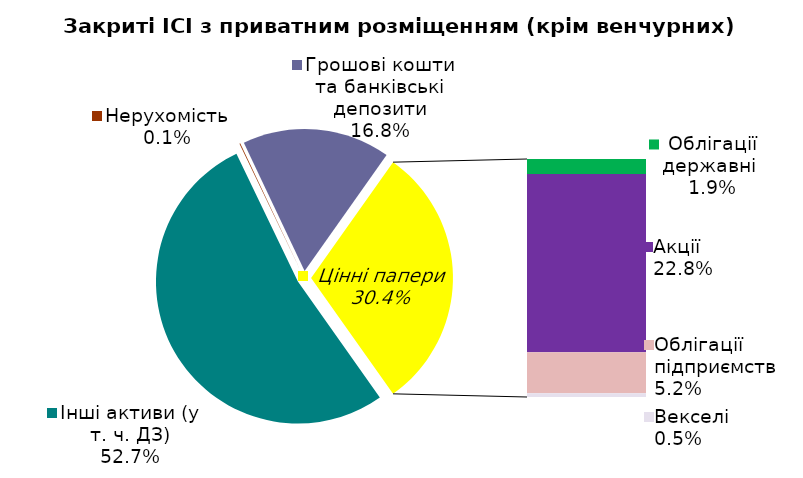
| Category | Series 0 |
|---|---|
| Інші активи (у т. ч. ДЗ) | 0.527 |
| Нерухомість | 0.001 |
| Грошові кошти та банківські депозити | 0.168 |
| Облігації державні  | 0.019 |
| Акцiї | 0.228 |
| Облігації підприємств | 0.052 |
| Векселі | 0.005 |